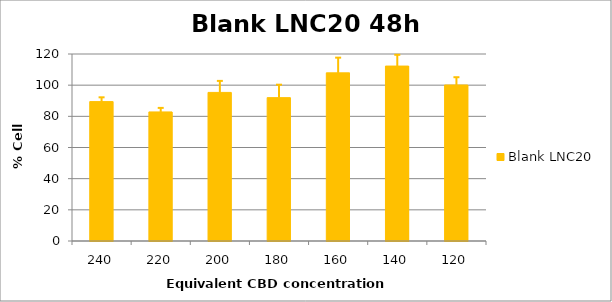
| Category | Blank LNC20 |
|---|---|
| 240.0 | 89.444 |
| 220.0 | 82.83 |
| 200.0 | 95.352 |
| 180.0 | 92.003 |
| 160.0 | 107.899 |
| 140.0 | 112.253 |
| 120.0 | 100.103 |